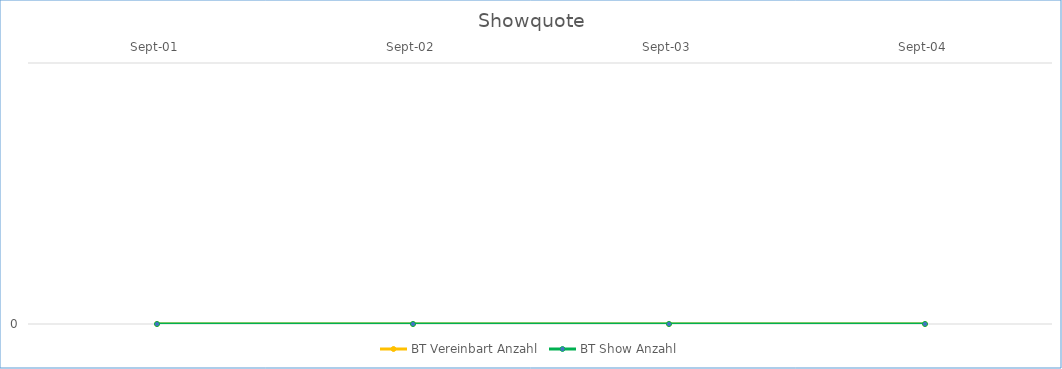
| Category | BT Vereinbart Anzahl | BT Show Anzahl |
|---|---|---|
| 2001-09-01 | 0 | 0 |
| 2002-09-01 | 0 | 0 |
| 2003-09-01 | 0 | 0 |
| 2004-09-01 | 0 | 0 |